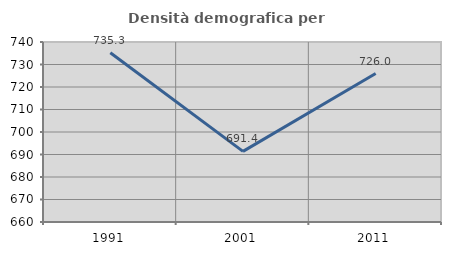
| Category | Densità demografica |
|---|---|
| 1991.0 | 735.253 |
| 2001.0 | 691.391 |
| 2011.0 | 725.974 |